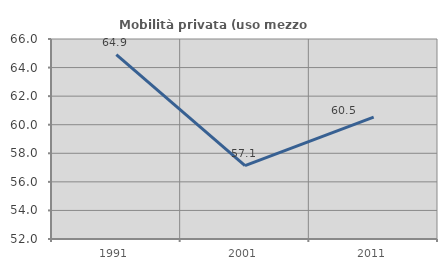
| Category | Mobilità privata (uso mezzo privato) |
|---|---|
| 1991.0 | 64.912 |
| 2001.0 | 57.143 |
| 2011.0 | 60.526 |